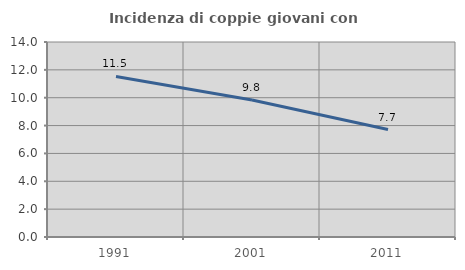
| Category | Incidenza di coppie giovani con figli |
|---|---|
| 1991.0 | 11.524 |
| 2001.0 | 9.841 |
| 2011.0 | 7.713 |